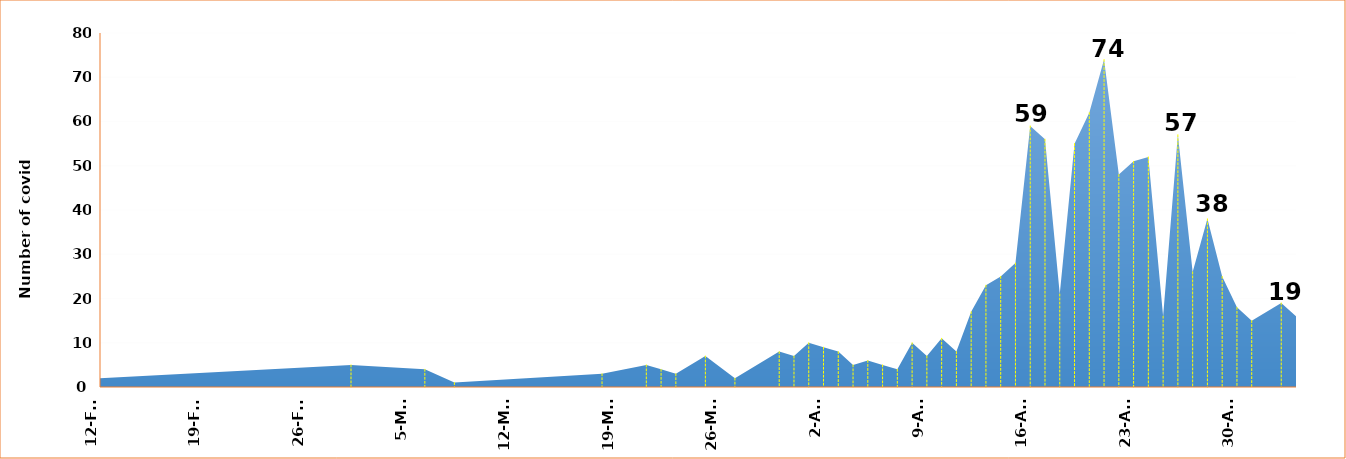
| Category | Series 0 |
|---|---|
| 2021-02-12 | 2 |
| 2021-03-01 | 5 |
| 2021-03-06 | 4 |
| 2021-03-08 | 1 |
| 2021-03-18 | 3 |
| 2021-03-21 | 5 |
| 2021-03-22 | 4 |
| 2021-03-23 | 3 |
| 2021-03-25 | 7 |
| 2021-03-27 | 2 |
| 2021-03-30 | 8 |
| 2021-03-31 | 7 |
| 2021-04-01 | 10 |
| 2021-04-02 | 9 |
| 2021-04-03 | 8 |
| 2021-04-04 | 5 |
| 2021-04-05 | 6 |
| 2021-04-06 | 5 |
| 2021-04-07 | 4 |
| 2021-04-08 | 10 |
| 2021-04-09 | 7 |
| 2021-04-10 | 11 |
| 2021-04-11 | 8 |
| 2021-04-12 | 17 |
| 2021-04-13 | 23 |
| 2021-04-14 | 25 |
| 2021-04-15 | 28 |
| 2021-04-16 | 59 |
| 2021-04-17 | 56 |
| 2021-04-18 | 21 |
| 2021-04-19 | 55 |
| 2021-04-20 | 62 |
| 2021-04-21 | 74 |
| 2021-04-22 | 48 |
| 2021-04-23 | 51 |
| 2021-04-24 | 52 |
| 2021-04-25 | 16 |
| 2021-04-26 | 57 |
| 2021-04-27 | 26 |
| 2021-04-28 | 38 |
| 2021-04-29 | 25 |
| 2021-04-30 | 18 |
| 2021-05-01 | 15 |
| 2021-05-03 | 19 |
| 2021-05-04 | 16 |